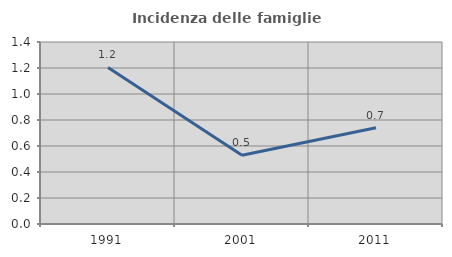
| Category | Incidenza delle famiglie numerose |
|---|---|
| 1991.0 | 1.204 |
| 2001.0 | 0.528 |
| 2011.0 | 0.74 |